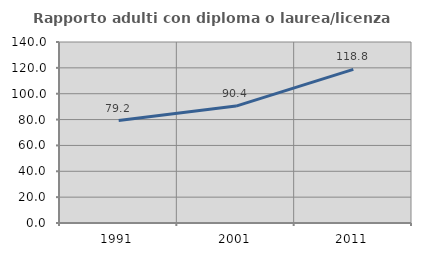
| Category | Rapporto adulti con diploma o laurea/licenza media  |
|---|---|
| 1991.0 | 79.245 |
| 2001.0 | 90.411 |
| 2011.0 | 118.841 |